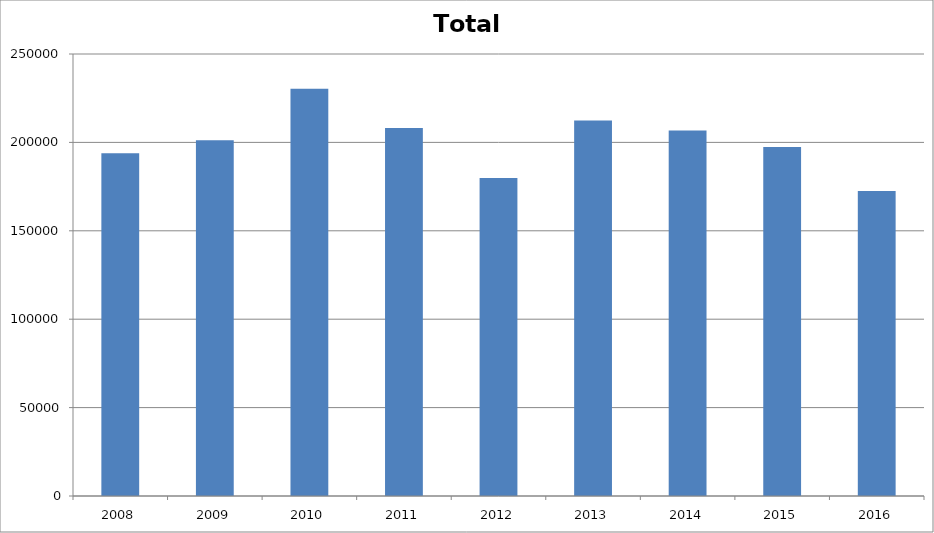
| Category | Total |
|---|---|
| 2008.0 | 193927 |
| 2009.0 | 201258 |
| 2010.0 | 230409 |
| 2011.0 | 208121 |
| 2012.0 | 179898 |
| 2013.0 | 212381 |
| 2014.0 | 206758 |
| 2015.0 | 197337.8 |
| 2016.0 | 172505 |